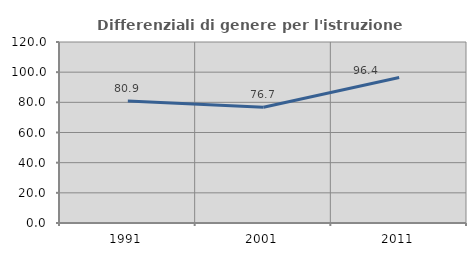
| Category | Differenziali di genere per l'istruzione superiore |
|---|---|
| 1991.0 | 80.852 |
| 2001.0 | 76.747 |
| 2011.0 | 96.421 |